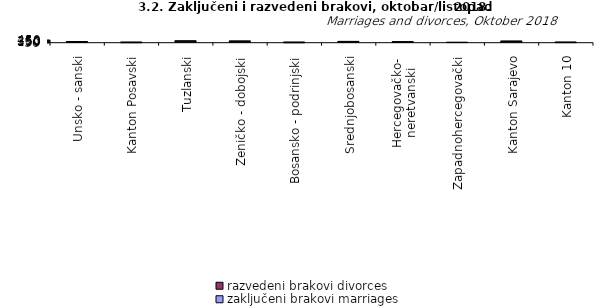
| Category | zaključeni brakovi marriages | razvedeni brakovi divorces |
|---|---|---|
| Unsko - sanski | 115 | 31 |
| Kanton Posavski | 6 | 7 |
| Tuzlanski | 236 | 26 |
| Zeničko - dobojski | 213 | 25 |
| Bosansko - podrinjski | 7 | 2 |
| Srednjobosanski | 136 | 12 |
| Hercegovačko-
neretvanski | 93 | 9 |
| Zapadnohercegovački | 24 | 0 |
| Kanton Sarajevo | 205 | 12 |
| Kanton 10 | 20 | 1 |